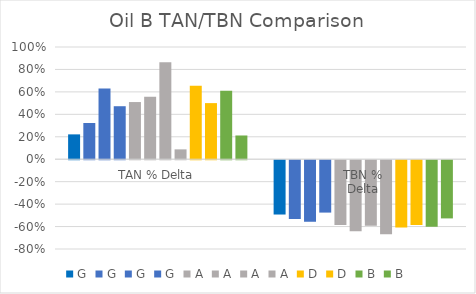
| Category | G | A | D | B |
|---|---|---|---|---|
| TAN % Delta | 0.472 | 0.088 | 0.5 | 0.212 |
| TBN %
Delta | -0.467 | -0.66 | -0.577 | -0.519 |